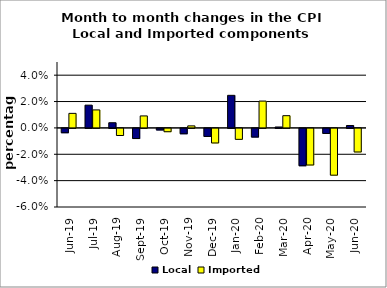
| Category | Local | Imported |
|---|---|---|
| 2019-06-01 | -0.003 | 0.011 |
| 2019-07-01 | 0.017 | 0.014 |
| 2019-08-01 | 0.004 | -0.005 |
| 2019-09-01 | -0.008 | 0.009 |
| 2019-10-01 | -0.001 | -0.003 |
| 2019-11-01 | -0.004 | 0.002 |
| 2019-12-01 | -0.006 | -0.011 |
| 2020-01-01 | 0.025 | -0.008 |
| 2020-02-01 | -0.007 | 0.02 |
| 2020-03-01 | 0.001 | 0.009 |
| 2020-04-01 | -0.028 | -0.028 |
| 2020-05-01 | -0.004 | -0.035 |
| 2020-06-01 | 0.002 | -0.018 |